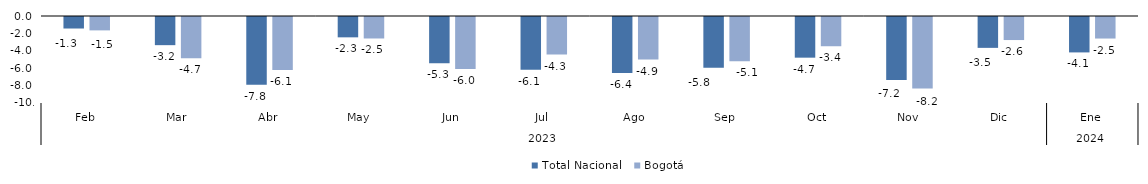
| Category | Total Nacional | Bogotá |
|---|---|---|
| 0 | -1.324 | -1.54 |
| 1 | -3.237 | -4.748 |
| 2 | -7.775 | -6.083 |
| 3 | -2.337 | -2.47 |
| 4 | -5.318 | -5.973 |
| 5 | -6.073 | -4.311 |
| 6 | -6.431 | -4.898 |
| 7 | -5.827 | -5.089 |
| 8 | -4.674 | -3.361 |
| 9 | -7.249 | -8.227 |
| 10 | -3.548 | -2.649 |
| 11 | -4.071 | -2.475 |